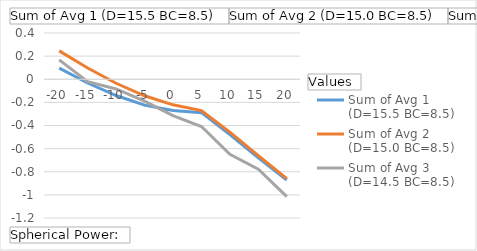
| Category | Sum of Avg 1 (D=15.5 BC=8.5) | Sum of Avg 2 (D=15.0 BC=8.5) | Sum of Avg 3 (D=14.5 BC=8.5) |
|---|---|---|---|
| -20 | 0.096 | 0.245 | 0.167 |
| -15 | -0.033 | 0.097 | -0.02 |
| -10 | -0.141 | -0.035 | -0.084 |
| -5 | -0.224 | -0.143 | -0.189 |
| 0 | -0.271 | -0.221 | -0.315 |
| 5 | -0.289 | -0.271 | -0.409 |
| 10 | -0.479 | -0.457 | -0.649 |
| 15 | -0.679 | -0.661 | -0.777 |
| 20 | -0.871 | -0.86 | -1.015 |